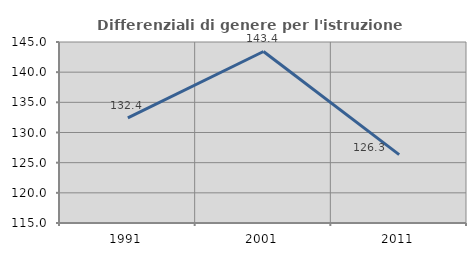
| Category | Differenziali di genere per l'istruzione superiore |
|---|---|
| 1991.0 | 132.411 |
| 2001.0 | 143.427 |
| 2011.0 | 126.333 |